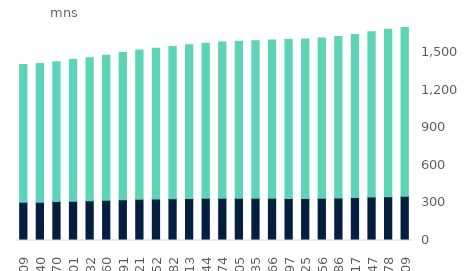
| Category | credit | debit |
|---|---|---|
| 2017-10-01 | 304.363 | 1099.92 |
| 2017-11-01 | 305.815 | 1106.047 |
| 2017-12-01 | 311.075 | 1116.29 |
| 2018-01-01 | 314.132 | 1129.98 |
| 2018-02-01 | 316.78 | 1141.682 |
| 2018-03-01 | 320.545 | 1158.302 |
| 2018-04-01 | 324.289 | 1175.431 |
| 2018-05-01 | 328.506 | 1191.664 |
| 2018-06-01 | 330.74 | 1202.907 |
| 2018-07-01 | 333.493 | 1215.806 |
| 2018-08-01 | 335.641 | 1227.152 |
| 2018-09-01 | 337.279 | 1236.897 |
| 2018-10-01 | 338.072 | 1245.29 |
| 2018-11-01 | 337.872 | 1252.65 |
| 2018-12-01 | 337.206 | 1257.455 |
| 2019-01-01 | 336.317 | 1263.357 |
| 2019-02-01 | 335.466 | 1268.126 |
| 2019-03-01 | 335.418 | 1272.842 |
| 2019-04-01 | 336.721 | 1279.34 |
| 2019-05-01 | 339.316 | 1288.985 |
| 2019-06-01 | 342.713 | 1301.816 |
| 2019-07-01 | 346.376 | 1319.975 |
| 2019-08-01 | 349.981 | 1335.746 |
| 2019-09-01 | 353.231 | 1350.951 |